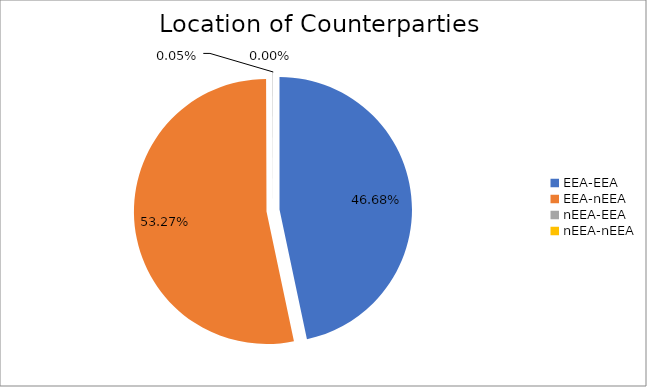
| Category | Series 0 |
|---|---|
| EEA-EEA | 6108171.378 |
| EEA-nEEA | 6970619.404 |
| nEEA-EEA | 6319.553 |
| nEEA-nEEA | 209.608 |